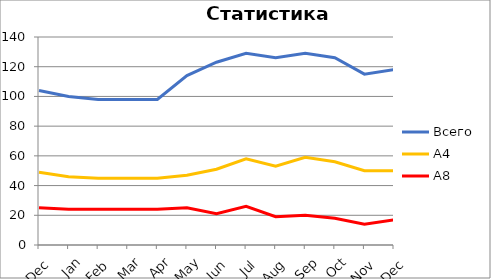
| Category | Всего | А4 | A8 |
|---|---|---|---|
| 0 | 104 | 49 | 25 |
| 1 | 100 | 46 | 24 |
| 2 | 98 | 45 | 24 |
| 3 | 98 | 45 | 24 |
| 4 | 98 | 45 | 24 |
| 5 | 114 | 47 | 25 |
| 6 | 123 | 51 | 21 |
| 7 | 129 | 58 | 26 |
| 8 | 126 | 53 | 19 |
| 9 | 129 | 59 | 20 |
| 10 | 126 | 56 | 18 |
| 11 | 115 | 50 | 14 |
| 12 | 118 | 50 | 17 |